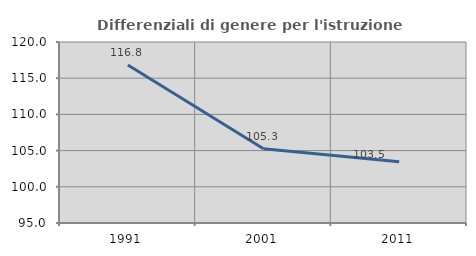
| Category | Differenziali di genere per l'istruzione superiore |
|---|---|
| 1991.0 | 116.835 |
| 2001.0 | 105.255 |
| 2011.0 | 103.453 |